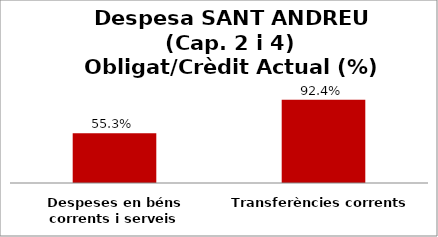
| Category | Series 0 |
|---|---|
| Despeses en béns corrents i serveis | 0.553 |
| Transferències corrents | 0.924 |